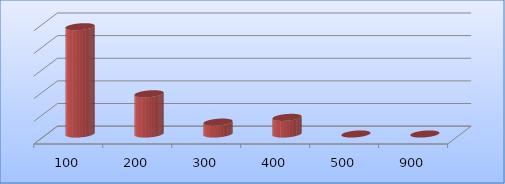
| Category | Series 0 |
|---|---|
| 100.0 | 47404663 |
| 200.0 | 17777219 |
| 300.0 | 5250000 |
| 400.0 | 7350000 |
| 500.0 | 0 |
| 900.0 | 0 |